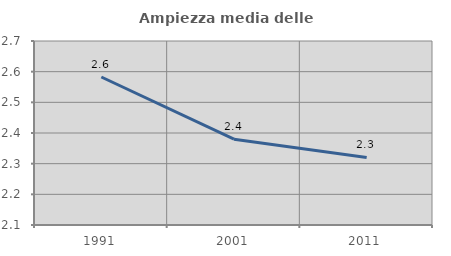
| Category | Ampiezza media delle famiglie |
|---|---|
| 1991.0 | 2.583 |
| 2001.0 | 2.38 |
| 2011.0 | 2.32 |